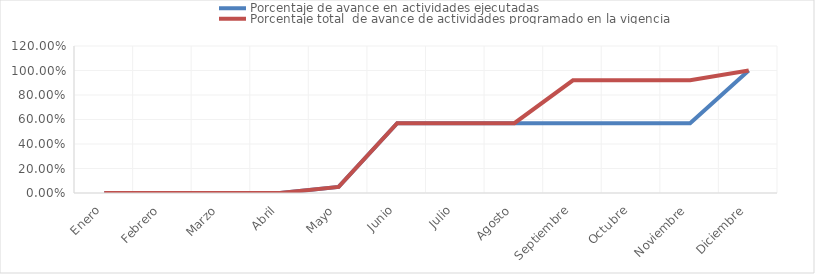
| Category | Porcentaje de avance en actividades ejecutadas | Porcentaje total  de avance de actividades programado en la vigencia |
|---|---|---|
| 0 | 0 | 0 |
| 1 | 0 | 0 |
| 2 | 0 | 0 |
| 3 | 0 | 0 |
| 4 | 0.05 | 0.05 |
| 5 | 0.57 | 0.57 |
| 6 | 0.57 | 0.57 |
| 7 | 0.57 | 0.57 |
| 8 | 0.57 | 0.92 |
| 9 | 0.57 | 0.92 |
| 10 | 0.57 | 0.92 |
| 11 | 1 | 1 |